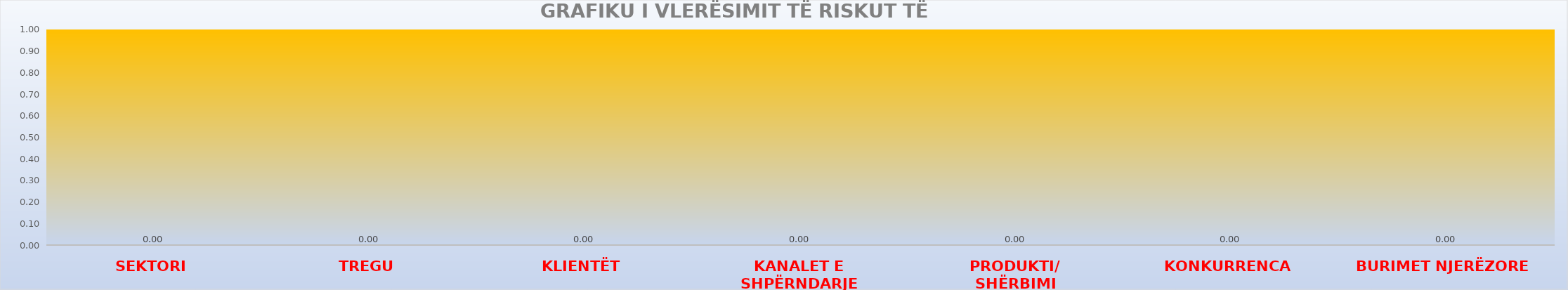
| Category | Series 0 |
|---|---|
| SEKTORI | 0 |
| TREGU | 0 |
| KLIENTËT | 0 |
| KANALET E SHPËRNDARJE | 0 |
| PRODUKTI/
SHËRBIMI | 0 |
| KONKURRENCA | 0 |
| BURIMET NJERËZORE | 0 |